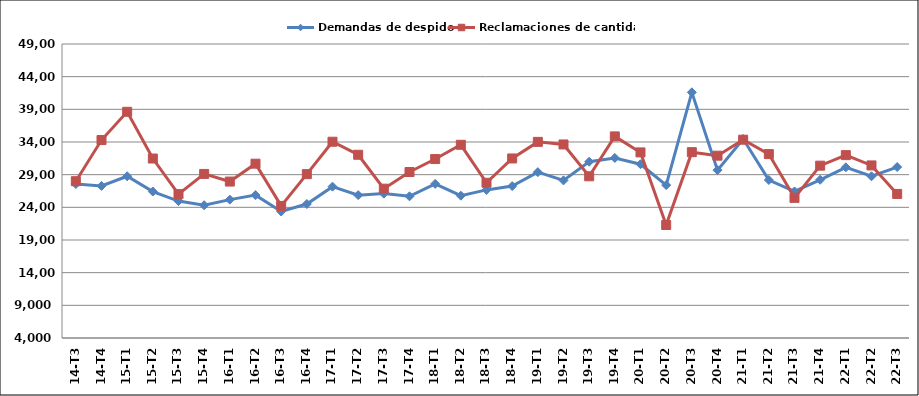
| Category | Demandas de despido | Reclamaciones de cantidad |
|---|---|---|
| 14-T3 | 27571 | 27999 |
| 14-T4 | 27278 | 34299 |
| 15-T1 | 28755 | 38621 |
| 15-T2 | 26417 | 31470 |
| 15-T3 | 24957 | 26018 |
| 15-T4 | 24328 | 29112 |
| 16-T1 | 25182 | 27945 |
| 16-T2 | 25866 | 30682 |
| 16-T3 | 23364 | 24220 |
| 16-T4 | 24509 | 29081 |
| 17-T1 | 27166 | 34041 |
| 17-T2 | 25869 | 32047 |
| 17-T3 | 26101 | 26854 |
| 17-T4 | 25688 | 29408 |
| 18-T1 | 27589 | 31392 |
| 18-T2 | 25785 | 33573 |
| 18-T3 | 26669 | 27761 |
| 18-T4 | 27251 | 31480 |
| 19-T1 | 29386 | 34020 |
| 19-T2 | 28121 | 33623 |
| 19-T3 | 30981 | 28752 |
| 19-T4 | 31561 | 34857 |
| 20-T1 | 30597 | 32408 |
| 20-T2 | 27401 | 21297 |
| 20-T3 | 41597 | 32446 |
| 20-T4 | 29692 | 31906 |
| 21-T1 | 34461 | 34356 |
| 21-T2 | 28179 | 32151 |
| 21-T3 | 26434 | 25447 |
| 21-T4 | 28219 | 30377 |
| 22-T1 | 30126 | 31990 |
| 22-T2 | 28753 | 30414 |
| 22-T3 | 30167 | 26050 |